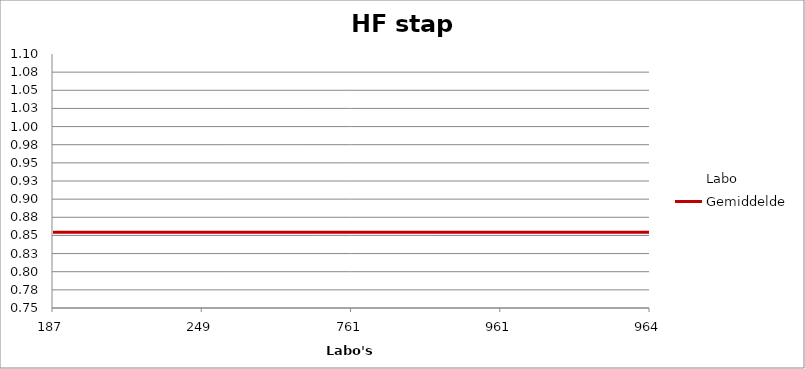
| Category | Labo | Gemiddelde |
|---|---|---|
| 187.0 | 16.752 | 0.854 |
| 249.0 | 0.904 | 0.854 |
| 761.0 | 0.836 | 0.854 |
| 961.0 | 0.785 | 0.854 |
| 964.0 | 0.894 | 0.854 |